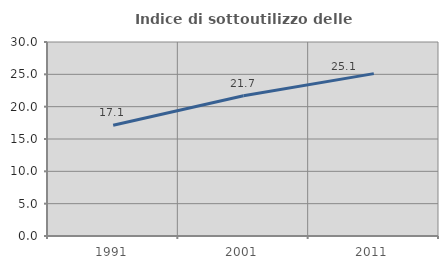
| Category | Indice di sottoutilizzo delle abitazioni  |
|---|---|
| 1991.0 | 17.133 |
| 2001.0 | 21.687 |
| 2011.0 | 25.111 |